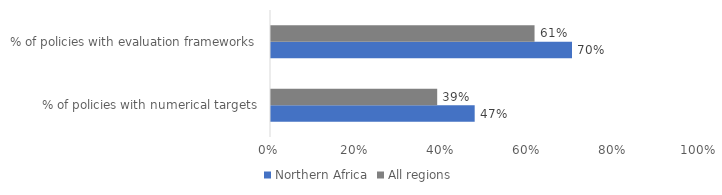
| Category | Northern Africa | All regions |
|---|---|---|
| % of policies with numerical targets | 0.474 | 0.387 |
| % of policies with evaluation frameworks | 0.7 | 0.613 |